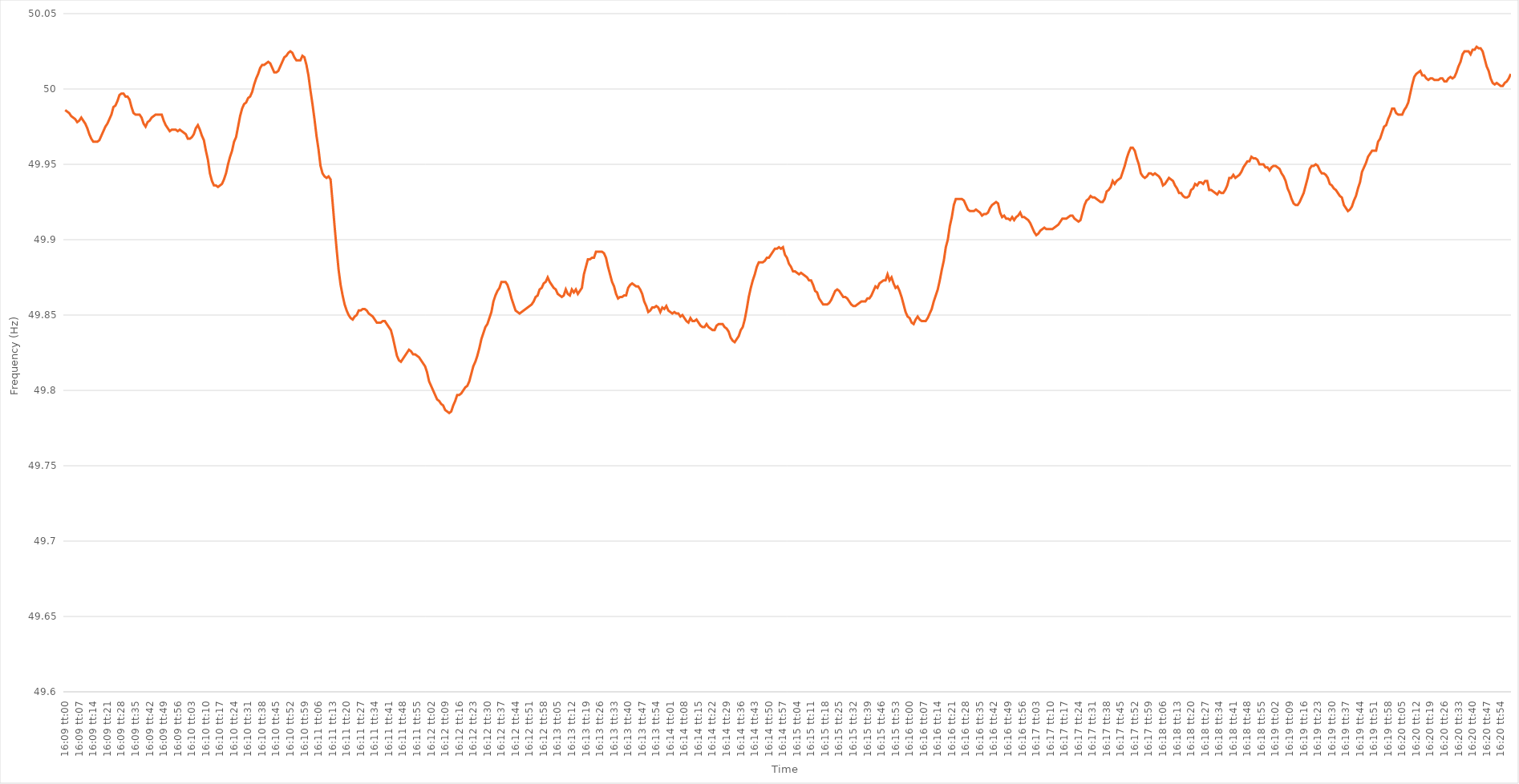
| Category | Series 0 |
|---|---|
| 0.6729166666666666 | 49.986 |
| 0.6729282407407408 | 49.985 |
| 0.6729398148148148 | 49.984 |
| 0.672951388888889 | 49.982 |
| 0.6729629629629629 | 49.981 |
| 0.672974537037037 | 49.98 |
| 0.6729861111111112 | 49.978 |
| 0.6729976851851852 | 49.979 |
| 0.6730092592592593 | 49.981 |
| 0.6730208333333333 | 49.979 |
| 0.6730324074074074 | 49.977 |
| 0.6730439814814816 | 49.974 |
| 0.6730555555555555 | 49.97 |
| 0.6730671296296297 | 49.967 |
| 0.6730787037037037 | 49.965 |
| 0.6730902777777777 | 49.965 |
| 0.6731018518518518 | 49.965 |
| 0.6731134259259259 | 49.966 |
| 0.6731250000000001 | 49.969 |
| 0.673136574074074 | 49.972 |
| 0.6731481481481482 | 49.975 |
| 0.6731597222222222 | 49.977 |
| 0.6731712962962964 | 49.98 |
| 0.6731828703703703 | 49.983 |
| 0.6731944444444444 | 49.988 |
| 0.6732060185185186 | 49.989 |
| 0.6732175925925926 | 49.992 |
| 0.6732291666666667 | 49.996 |
| 0.6732407407407407 | 49.997 |
| 0.6732523148148148 | 49.997 |
| 0.673263888888889 | 49.995 |
| 0.6732754629629629 | 49.995 |
| 0.6732870370370371 | 49.993 |
| 0.6732986111111111 | 49.988 |
| 0.6733101851851852 | 49.984 |
| 0.6733217592592592 | 49.983 |
| 0.6733333333333333 | 49.983 |
| 0.6733449074074075 | 49.983 |
| 0.6733564814814814 | 49.981 |
| 0.6733680555555556 | 49.977 |
| 0.6733796296296296 | 49.975 |
| 0.6733912037037038 | 49.978 |
| 0.6734027777777777 | 49.979 |
| 0.6734143518518518 | 49.981 |
| 0.673425925925926 | 49.982 |
| 0.6734375 | 49.983 |
| 0.6734490740740741 | 49.983 |
| 0.6734606481481481 | 49.983 |
| 0.6734722222222222 | 49.983 |
| 0.6734837962962964 | 49.979 |
| 0.6734953703703703 | 49.976 |
| 0.6735069444444445 | 49.974 |
| 0.6735185185185185 | 49.972 |
| 0.6735300925925927 | 49.973 |
| 0.6735416666666666 | 49.973 |
| 0.6735532407407407 | 49.973 |
| 0.6735648148148149 | 49.972 |
| 0.6735763888888888 | 49.973 |
| 0.673587962962963 | 49.972 |
| 0.673599537037037 | 49.971 |
| 0.6736111111111112 | 49.97 |
| 0.6736226851851851 | 49.967 |
| 0.6736342592592592 | 49.967 |
| 0.6736458333333334 | 49.968 |
| 0.6736574074074074 | 49.97 |
| 0.6736689814814815 | 49.974 |
| 0.6736805555555555 | 49.976 |
| 0.6736921296296297 | 49.973 |
| 0.6737037037037038 | 49.969 |
| 0.6737152777777777 | 49.966 |
| 0.6737268518518519 | 49.959 |
| 0.6737384259259259 | 49.953 |
| 0.6737500000000001 | 49.944 |
| 0.673761574074074 | 49.939 |
| 0.6737731481481481 | 49.936 |
| 0.6737847222222223 | 49.936 |
| 0.6737962962962962 | 49.935 |
| 0.6738078703703704 | 49.936 |
| 0.6738194444444444 | 49.937 |
| 0.6738310185185186 | 49.94 |
| 0.6738425925925925 | 49.944 |
| 0.6738541666666666 | 49.95 |
| 0.6738657407407408 | 49.955 |
| 0.6738773148148148 | 49.959 |
| 0.6738888888888889 | 49.965 |
| 0.6739004629629629 | 49.968 |
| 0.6739120370370371 | 49.975 |
| 0.6739236111111112 | 49.982 |
| 0.6739351851851851 | 49.987 |
| 0.6739467592592593 | 49.99 |
| 0.6739583333333333 | 49.991 |
| 0.6739699074074075 | 49.994 |
| 0.6739814814814814 | 49.995 |
| 0.6739930555555556 | 49.998 |
| 0.6740046296296297 | 50.003 |
| 0.6740162037037036 | 50.007 |
| 0.6740277777777778 | 50.01 |
| 0.6740393518518518 | 50.014 |
| 0.674050925925926 | 50.016 |
| 0.6740624999999999 | 50.016 |
| 0.674074074074074 | 50.017 |
| 0.6740856481481482 | 50.018 |
| 0.6740972222222222 | 50.017 |
| 0.6741087962962963 | 50.014 |
| 0.6741203703703703 | 50.011 |
| 0.6741319444444445 | 50.011 |
| 0.6741435185185186 | 50.012 |
| 0.6741550925925925 | 50.015 |
| 0.6741666666666667 | 50.018 |
| 0.6741782407407407 | 50.021 |
| 0.6741898148148149 | 50.022 |
| 0.6742013888888888 | 50.024 |
| 0.674212962962963 | 50.025 |
| 0.6742245370370371 | 50.024 |
| 0.6742361111111111 | 50.021 |
| 0.6742476851851852 | 50.019 |
| 0.6742592592592592 | 50.019 |
| 0.6742708333333334 | 50.019 |
| 0.6742824074074073 | 50.022 |
| 0.6742939814814815 | 50.021 |
| 0.6743055555555556 | 50.016 |
| 0.6743171296296296 | 50.009 |
| 0.6743287037037037 | 49.999 |
| 0.6743402777777777 | 49.99 |
| 0.6743518518518519 | 49.98 |
| 0.674363425925926 | 49.969 |
| 0.674375 | 49.96 |
| 0.6743865740740741 | 49.949 |
| 0.6743981481481481 | 49.944 |
| 0.6744097222222223 | 49.942 |
| 0.6744212962962962 | 49.941 |
| 0.6744328703703704 | 49.942 |
| 0.6744444444444445 | 49.94 |
| 0.6744560185185186 | 49.925 |
| 0.6744675925925926 | 49.909 |
| 0.6744791666666666 | 49.894 |
| 0.6744907407407408 | 49.88 |
| 0.6745023148148147 | 49.87 |
| 0.6745138888888889 | 49.863 |
| 0.674525462962963 | 49.857 |
| 0.674537037037037 | 49.853 |
| 0.6745486111111111 | 49.85 |
| 0.6745601851851851 | 49.848 |
| 0.6745717592592593 | 49.847 |
| 0.6745833333333334 | 49.849 |
| 0.6745949074074074 | 49.85 |
| 0.6746064814814815 | 49.853 |
| 0.6746180555555555 | 49.853 |
| 0.6746296296296297 | 49.854 |
| 0.6746412037037036 | 49.854 |
| 0.6746527777777778 | 49.853 |
| 0.6746643518518519 | 49.851 |
| 0.674675925925926 | 49.85 |
| 0.6746875 | 49.849 |
| 0.674699074074074 | 49.847 |
| 0.6747106481481482 | 49.845 |
| 0.6747222222222221 | 49.845 |
| 0.6747337962962963 | 49.845 |
| 0.6747453703703704 | 49.846 |
| 0.6747569444444445 | 49.846 |
| 0.6747685185185185 | 49.844 |
| 0.6747800925925925 | 49.842 |
| 0.6747916666666667 | 49.84 |
| 0.6748032407407408 | 49.835 |
| 0.6748148148148148 | 49.829 |
| 0.6748263888888889 | 49.823 |
| 0.674837962962963 | 49.82 |
| 0.6748495370370371 | 49.819 |
| 0.674861111111111 | 49.821 |
| 0.6748726851851852 | 49.823 |
| 0.6748842592592593 | 49.825 |
| 0.6748958333333334 | 49.827 |
| 0.6749074074074074 | 49.826 |
| 0.6749189814814814 | 49.824 |
| 0.6749305555555556 | 49.824 |
| 0.6749421296296297 | 49.823 |
| 0.6749537037037037 | 49.822 |
| 0.6749652777777778 | 49.82 |
| 0.6749768518518519 | 49.818 |
| 0.6749884259259259 | 49.816 |
| 0.6749999999999999 | 49.812 |
| 0.6750115740740741 | 49.806 |
| 0.6750231481481482 | 49.803 |
| 0.6750347222222222 | 49.8 |
| 0.6750462962962963 | 49.797 |
| 0.6750578703703703 | 49.794 |
| 0.6750694444444445 | 49.793 |
| 0.6750810185185184 | 49.791 |
| 0.6750925925925926 | 49.79 |
| 0.6751041666666667 | 49.787 |
| 0.6751157407407408 | 49.786 |
| 0.6751273148148148 | 49.785 |
| 0.6751388888888888 | 49.786 |
| 0.675150462962963 | 49.79 |
| 0.6751620370370371 | 49.793 |
| 0.6751736111111111 | 49.797 |
| 0.6751851851851852 | 49.797 |
| 0.6751967592592593 | 49.798 |
| 0.6752083333333333 | 49.8 |
| 0.6752199074074073 | 49.802 |
| 0.6752314814814815 | 49.803 |
| 0.6752430555555556 | 49.806 |
| 0.6752546296296296 | 49.811 |
| 0.6752662037037037 | 49.816 |
| 0.6752777777777778 | 49.819 |
| 0.6752893518518519 | 49.823 |
| 0.6753009259259258 | 49.828 |
| 0.6753125 | 49.834 |
| 0.6753240740740741 | 49.838 |
| 0.6753356481481482 | 49.842 |
| 0.6753472222222222 | 49.844 |
| 0.6753587962962962 | 49.848 |
| 0.6753703703703704 | 49.852 |
| 0.6753819444444445 | 49.859 |
| 0.6753935185185185 | 49.863 |
| 0.6754050925925926 | 49.866 |
| 0.6754166666666667 | 49.868 |
| 0.6754282407407407 | 49.872 |
| 0.6754398148148147 | 49.872 |
| 0.6754513888888889 | 49.872 |
| 0.675462962962963 | 49.87 |
| 0.675474537037037 | 49.866 |
| 0.6754861111111111 | 49.861 |
| 0.6754976851851852 | 49.857 |
| 0.6755092592592593 | 49.853 |
| 0.6755208333333332 | 49.852 |
| 0.6755324074074074 | 49.851 |
| 0.6755439814814815 | 49.852 |
| 0.6755555555555556 | 49.853 |
| 0.6755671296296296 | 49.854 |
| 0.6755787037037037 | 49.855 |
| 0.6755902777777778 | 49.856 |
| 0.675601851851852 | 49.857 |
| 0.6756134259259259 | 49.859 |
| 0.675625 | 49.862 |
| 0.6756365740740741 | 49.863 |
| 0.6756481481481482 | 49.867 |
| 0.6756597222222221 | 49.868 |
| 0.6756712962962963 | 49.871 |
| 0.6756828703703704 | 49.872 |
| 0.6756944444444444 | 49.875 |
| 0.6757060185185185 | 49.872 |
| 0.6757175925925926 | 49.87 |
| 0.6757291666666667 | 49.868 |
| 0.6757407407407406 | 49.867 |
| 0.6757523148148148 | 49.864 |
| 0.6757638888888889 | 49.863 |
| 0.675775462962963 | 49.862 |
| 0.675787037037037 | 49.863 |
| 0.6757986111111111 | 49.867 |
| 0.6758101851851852 | 49.864 |
| 0.6758217592592594 | 49.863 |
| 0.6758333333333333 | 49.867 |
| 0.6758449074074074 | 49.865 |
| 0.6758564814814815 | 49.867 |
| 0.6758680555555556 | 49.864 |
| 0.6758796296296296 | 49.866 |
| 0.6758912037037037 | 49.868 |
| 0.6759027777777779 | 49.877 |
| 0.6759143518518518 | 49.882 |
| 0.6759259259259259 | 49.887 |
| 0.6759375 | 49.887 |
| 0.6759490740740741 | 49.888 |
| 0.675960648148148 | 49.888 |
| 0.6759722222222222 | 49.892 |
| 0.6759837962962963 | 49.892 |
| 0.6759953703703704 | 49.892 |
| 0.6760069444444444 | 49.892 |
| 0.6760185185185185 | 49.891 |
| 0.6760300925925926 | 49.888 |
| 0.6760416666666668 | 49.882 |
| 0.6760532407407407 | 49.877 |
| 0.6760648148148148 | 49.872 |
| 0.6760763888888889 | 49.869 |
| 0.676087962962963 | 49.864 |
| 0.676099537037037 | 49.861 |
| 0.6761111111111111 | 49.862 |
| 0.6761226851851853 | 49.862 |
| 0.6761342592592593 | 49.863 |
| 0.6761458333333333 | 49.863 |
| 0.6761574074074074 | 49.868 |
| 0.6761689814814815 | 49.87 |
| 0.6761805555555555 | 49.871 |
| 0.6761921296296296 | 49.87 |
| 0.6762037037037038 | 49.869 |
| 0.6762152777777778 | 49.869 |
| 0.6762268518518518 | 49.867 |
| 0.6762384259259259 | 49.864 |
| 0.67625 | 49.859 |
| 0.6762615740740742 | 49.856 |
| 0.6762731481481481 | 49.852 |
| 0.6762847222222222 | 49.853 |
| 0.6762962962962963 | 49.855 |
| 0.6763078703703704 | 49.855 |
| 0.6763194444444444 | 49.856 |
| 0.6763310185185185 | 49.855 |
| 0.6763425925925927 | 49.852 |
| 0.6763541666666667 | 49.855 |
| 0.6763657407407407 | 49.854 |
| 0.6763773148148148 | 49.856 |
| 0.6763888888888889 | 49.853 |
| 0.6764004629629629 | 49.852 |
| 0.676412037037037 | 49.851 |
| 0.6764236111111112 | 49.852 |
| 0.6764351851851852 | 49.851 |
| 0.6764467592592592 | 49.851 |
| 0.6764583333333333 | 49.849 |
| 0.6764699074074074 | 49.85 |
| 0.6764814814814816 | 49.848 |
| 0.6764930555555555 | 49.846 |
| 0.6765046296296297 | 49.845 |
| 0.6765162037037037 | 49.848 |
| 0.6765277777777778 | 49.846 |
| 0.6765393518518518 | 49.846 |
| 0.6765509259259259 | 49.847 |
| 0.6765625000000001 | 49.845 |
| 0.6765740740740741 | 49.843 |
| 0.6765856481481481 | 49.842 |
| 0.6765972222222222 | 49.842 |
| 0.6766087962962963 | 49.844 |
| 0.6766203703703703 | 49.842 |
| 0.6766319444444444 | 49.841 |
| 0.6766435185185186 | 49.84 |
| 0.6766550925925926 | 49.84 |
| 0.6766666666666666 | 49.843 |
| 0.6766782407407407 | 49.844 |
| 0.6766898148148148 | 49.844 |
| 0.676701388888889 | 49.844 |
| 0.6767129629629629 | 49.842 |
| 0.676724537037037 | 49.841 |
| 0.6767361111111111 | 49.839 |
| 0.6767476851851852 | 49.835 |
| 0.6767592592592592 | 49.833 |
| 0.6767708333333333 | 49.832 |
| 0.6767824074074075 | 49.834 |
| 0.6767939814814815 | 49.836 |
| 0.6768055555555555 | 49.84 |
| 0.6768171296296296 | 49.842 |
| 0.6768287037037037 | 49.847 |
| 0.6768402777777779 | 49.854 |
| 0.6768518518518518 | 49.862 |
| 0.676863425925926 | 49.868 |
| 0.676875 | 49.873 |
| 0.676886574074074 | 49.877 |
| 0.6768981481481481 | 49.882 |
| 0.6769097222222222 | 49.885 |
| 0.6769212962962964 | 49.885 |
| 0.6769328703703703 | 49.885 |
| 0.6769444444444445 | 49.886 |
| 0.6769560185185185 | 49.888 |
| 0.6769675925925926 | 49.888 |
| 0.6769791666666666 | 49.89 |
| 0.6769907407407407 | 49.892 |
| 0.6770023148148149 | 49.894 |
| 0.6770138888888889 | 49.894 |
| 0.677025462962963 | 49.895 |
| 0.677037037037037 | 49.894 |
| 0.6770486111111111 | 49.895 |
| 0.6770601851851853 | 49.89 |
| 0.6770717592592592 | 49.888 |
| 0.6770833333333334 | 49.884 |
| 0.6770949074074074 | 49.882 |
| 0.6771064814814814 | 49.879 |
| 0.6771180555555555 | 49.879 |
| 0.6771296296296296 | 49.878 |
| 0.6771412037037038 | 49.877 |
| 0.6771527777777777 | 49.878 |
| 0.6771643518518519 | 49.877 |
| 0.6771759259259259 | 49.876 |
| 0.6771875 | 49.875 |
| 0.677199074074074 | 49.873 |
| 0.6772106481481481 | 49.873 |
| 0.6772222222222223 | 49.87 |
| 0.6772337962962963 | 49.866 |
| 0.6772453703703704 | 49.865 |
| 0.6772569444444444 | 49.861 |
| 0.6772685185185185 | 49.859 |
| 0.6772800925925927 | 49.857 |
| 0.6772916666666666 | 49.857 |
| 0.6773032407407408 | 49.857 |
| 0.6773148148148148 | 49.858 |
| 0.6773263888888889 | 49.86 |
| 0.6773379629629629 | 49.863 |
| 0.677349537037037 | 49.866 |
| 0.6773611111111112 | 49.867 |
| 0.6773726851851851 | 49.866 |
| 0.6773842592592593 | 49.864 |
| 0.6773958333333333 | 49.862 |
| 0.6774074074074075 | 49.862 |
| 0.6774189814814814 | 49.861 |
| 0.6774305555555555 | 49.859 |
| 0.6774421296296297 | 49.857 |
| 0.6774537037037037 | 49.856 |
| 0.6774652777777778 | 49.856 |
| 0.6774768518518518 | 49.857 |
| 0.677488425925926 | 49.858 |
| 0.6775000000000001 | 49.859 |
| 0.677511574074074 | 49.859 |
| 0.6775231481481482 | 49.859 |
| 0.6775347222222222 | 49.861 |
| 0.6775462962962964 | 49.861 |
| 0.6775578703703703 | 49.863 |
| 0.6775694444444444 | 49.866 |
| 0.6775810185185186 | 49.869 |
| 0.6775925925925925 | 49.868 |
| 0.6776041666666667 | 49.871 |
| 0.6776157407407407 | 49.872 |
| 0.6776273148148149 | 49.873 |
| 0.6776388888888888 | 49.873 |
| 0.6776504629629629 | 49.877 |
| 0.6776620370370371 | 49.873 |
| 0.6776736111111111 | 49.875 |
| 0.6776851851851852 | 49.871 |
| 0.6776967592592592 | 49.868 |
| 0.6777083333333334 | 49.869 |
| 0.6777199074074075 | 49.866 |
| 0.6777314814814814 | 49.862 |
| 0.6777430555555556 | 49.857 |
| 0.6777546296296296 | 49.852 |
| 0.6777662037037038 | 49.849 |
| 0.6777777777777777 | 49.848 |
| 0.6777893518518519 | 49.845 |
| 0.677800925925926 | 49.844 |
| 0.6778124999999999 | 49.847 |
| 0.6778240740740741 | 49.849 |
| 0.6778356481481481 | 49.847 |
| 0.6778472222222223 | 49.846 |
| 0.6778587962962962 | 49.846 |
| 0.6778703703703703 | 49.846 |
| 0.6778819444444445 | 49.848 |
| 0.6778935185185185 | 49.851 |
| 0.6779050925925926 | 49.854 |
| 0.6779166666666666 | 49.859 |
| 0.6779282407407408 | 49.863 |
| 0.6779398148148149 | 49.867 |
| 0.6779513888888888 | 49.873 |
| 0.677962962962963 | 49.88 |
| 0.677974537037037 | 49.886 |
| 0.6779861111111112 | 49.895 |
| 0.6779976851851851 | 49.9 |
| 0.6780092592592593 | 49.909 |
| 0.6780208333333334 | 49.915 |
| 0.6780324074074073 | 49.923 |
| 0.6780439814814815 | 49.927 |
| 0.6780555555555555 | 49.927 |
| 0.6780671296296297 | 49.927 |
| 0.6780787037037036 | 49.927 |
| 0.6780902777777778 | 49.926 |
| 0.6781018518518519 | 49.923 |
| 0.6781134259259259 | 49.92 |
| 0.678125 | 49.919 |
| 0.678136574074074 | 49.919 |
| 0.6781481481481482 | 49.919 |
| 0.6781597222222223 | 49.92 |
| 0.6781712962962962 | 49.919 |
| 0.6781828703703704 | 49.918 |
| 0.6781944444444444 | 49.916 |
| 0.6782060185185186 | 49.917 |
| 0.6782175925925925 | 49.917 |
| 0.6782291666666667 | 49.918 |
| 0.6782407407407408 | 49.921 |
| 0.6782523148148148 | 49.923 |
| 0.6782638888888889 | 49.924 |
| 0.6782754629629629 | 49.925 |
| 0.6782870370370371 | 49.924 |
| 0.678298611111111 | 49.918 |
| 0.6783101851851852 | 49.915 |
| 0.6783217592592593 | 49.916 |
| 0.6783333333333333 | 49.914 |
| 0.6783449074074074 | 49.914 |
| 0.6783564814814814 | 49.913 |
| 0.6783680555555556 | 49.915 |
| 0.6783796296296297 | 49.913 |
| 0.6783912037037036 | 49.915 |
| 0.6784027777777778 | 49.916 |
| 0.6784143518518518 | 49.918 |
| 0.678425925925926 | 49.915 |
| 0.6784374999999999 | 49.915 |
| 0.6784490740740741 | 49.914 |
| 0.6784606481481482 | 49.913 |
| 0.6784722222222223 | 49.911 |
| 0.6784837962962963 | 49.908 |
| 0.6784953703703703 | 49.905 |
| 0.6785069444444445 | 49.903 |
| 0.6785185185185184 | 49.904 |
| 0.6785300925925926 | 49.906 |
| 0.6785416666666667 | 49.907 |
| 0.6785532407407407 | 49.908 |
| 0.6785648148148148 | 49.907 |
| 0.6785763888888888 | 49.907 |
| 0.678587962962963 | 49.907 |
| 0.6785995370370371 | 49.907 |
| 0.678611111111111 | 49.908 |
| 0.6786226851851852 | 49.909 |
| 0.6786342592592592 | 49.91 |
| 0.6786458333333334 | 49.912 |
| 0.6786574074074073 | 49.914 |
| 0.6786689814814815 | 49.914 |
| 0.6786805555555556 | 49.914 |
| 0.6786921296296297 | 49.915 |
| 0.6787037037037037 | 49.916 |
| 0.6787152777777777 | 49.916 |
| 0.6787268518518519 | 49.914 |
| 0.678738425925926 | 49.913 |
| 0.67875 | 49.912 |
| 0.6787615740740741 | 49.913 |
| 0.6787731481481482 | 49.918 |
| 0.6787847222222222 | 49.923 |
| 0.6787962962962962 | 49.926 |
| 0.6788078703703704 | 49.927 |
| 0.6788194444444445 | 49.929 |
| 0.6788310185185185 | 49.928 |
| 0.6788425925925926 | 49.928 |
| 0.6788541666666666 | 49.927 |
| 0.6788657407407408 | 49.926 |
| 0.6788773148148147 | 49.925 |
| 0.6788888888888889 | 49.925 |
| 0.678900462962963 | 49.927 |
| 0.6789120370370371 | 49.932 |
| 0.6789236111111111 | 49.933 |
| 0.6789351851851851 | 49.935 |
| 0.6789467592592593 | 49.939 |
| 0.6789583333333334 | 49.937 |
| 0.6789699074074074 | 49.939 |
| 0.6789814814814815 | 49.94 |
| 0.6789930555555556 | 49.941 |
| 0.6790046296296296 | 49.945 |
| 0.6790162037037036 | 49.949 |
| 0.6790277777777778 | 49.954 |
| 0.6790393518518519 | 49.958 |
| 0.6790509259259259 | 49.961 |
| 0.6790625 | 49.961 |
| 0.679074074074074 | 49.959 |
| 0.6790856481481482 | 49.954 |
| 0.6790972222222221 | 49.95 |
| 0.6791087962962963 | 49.944 |
| 0.6791203703703704 | 49.942 |
| 0.6791319444444445 | 49.941 |
| 0.6791435185185185 | 49.942 |
| 0.6791550925925925 | 49.944 |
| 0.6791666666666667 | 49.944 |
| 0.6791782407407408 | 49.943 |
| 0.6791898148148148 | 49.944 |
| 0.6792013888888889 | 49.943 |
| 0.679212962962963 | 49.942 |
| 0.679224537037037 | 49.94 |
| 0.679236111111111 | 49.936 |
| 0.6792476851851852 | 49.937 |
| 0.6792592592592593 | 49.939 |
| 0.6792708333333333 | 49.941 |
| 0.6792824074074074 | 49.94 |
| 0.6792939814814815 | 49.939 |
| 0.6793055555555556 | 49.936 |
| 0.6793171296296295 | 49.934 |
| 0.6793287037037037 | 49.931 |
| 0.6793402777777778 | 49.931 |
| 0.6793518518518519 | 49.929 |
| 0.6793634259259259 | 49.928 |
| 0.679375 | 49.928 |
| 0.6793865740740741 | 49.929 |
| 0.6793981481481483 | 49.933 |
| 0.6794097222222222 | 49.934 |
| 0.6794212962962963 | 49.937 |
| 0.6794328703703704 | 49.936 |
| 0.6794444444444444 | 49.938 |
| 0.6794560185185184 | 49.938 |
| 0.6794675925925926 | 49.937 |
| 0.6794791666666667 | 49.939 |
| 0.6794907407407407 | 49.939 |
| 0.6795023148148148 | 49.933 |
| 0.6795138888888889 | 49.933 |
| 0.679525462962963 | 49.932 |
| 0.6795370370370369 | 49.931 |
| 0.6795486111111111 | 49.93 |
| 0.6795601851851852 | 49.932 |
| 0.6795717592592593 | 49.931 |
| 0.6795833333333333 | 49.931 |
| 0.6795949074074074 | 49.933 |
| 0.6796064814814815 | 49.936 |
| 0.6796180555555557 | 49.941 |
| 0.6796296296296296 | 49.941 |
| 0.6796412037037037 | 49.943 |
| 0.6796527777777778 | 49.941 |
| 0.6796643518518519 | 49.942 |
| 0.6796759259259259 | 49.943 |
| 0.6796875 | 49.945 |
| 0.6796990740740741 | 49.948 |
| 0.6797106481481481 | 49.95 |
| 0.6797222222222222 | 49.952 |
| 0.6797337962962963 | 49.952 |
| 0.6797453703703704 | 49.955 |
| 0.6797569444444443 | 49.954 |
| 0.6797685185185185 | 49.954 |
| 0.6797800925925926 | 49.953 |
| 0.6797916666666667 | 49.95 |
| 0.6798032407407407 | 49.95 |
| 0.6798148148148148 | 49.95 |
| 0.6798263888888889 | 49.948 |
| 0.6798379629629631 | 49.948 |
| 0.679849537037037 | 49.946 |
| 0.6798611111111111 | 49.948 |
| 0.6798726851851852 | 49.949 |
| 0.6798842592592593 | 49.949 |
| 0.6798958333333333 | 49.948 |
| 0.6799074074074074 | 49.947 |
| 0.6799189814814816 | 49.944 |
| 0.6799305555555556 | 49.942 |
| 0.6799421296296296 | 49.939 |
| 0.6799537037037037 | 49.934 |
| 0.6799652777777778 | 49.931 |
| 0.6799768518518517 | 49.927 |
| 0.6799884259259259 | 49.924 |
| 0.68 | 49.923 |
| 0.6800115740740741 | 49.923 |
| 0.6800231481481481 | 49.925 |
| 0.6800347222222222 | 49.928 |
| 0.6800462962962963 | 49.931 |
| 0.6800578703703705 | 49.936 |
| 0.6800694444444444 | 49.941 |
| 0.6800810185185185 | 49.947 |
| 0.6800925925925926 | 49.949 |
| 0.6801041666666667 | 49.949 |
| 0.6801157407407407 | 49.95 |
| 0.6801273148148148 | 49.949 |
| 0.680138888888889 | 49.946 |
| 0.680150462962963 | 49.944 |
| 0.680162037037037 | 49.944 |
| 0.6801736111111111 | 49.943 |
| 0.6801851851851852 | 49.941 |
| 0.6801967592592592 | 49.937 |
| 0.6802083333333333 | 49.936 |
| 0.6802199074074075 | 49.934 |
| 0.6802314814814815 | 49.933 |
| 0.6802430555555555 | 49.931 |
| 0.6802546296296296 | 49.929 |
| 0.6802662037037037 | 49.928 |
| 0.6802777777777779 | 49.923 |
| 0.6802893518518518 | 49.921 |
| 0.680300925925926 | 49.919 |
| 0.6803125 | 49.92 |
| 0.6803240740740741 | 49.922 |
| 0.6803356481481481 | 49.926 |
| 0.6803472222222222 | 49.929 |
| 0.6803587962962964 | 49.934 |
| 0.6803703703703704 | 49.938 |
| 0.6803819444444444 | 49.945 |
| 0.6803935185185185 | 49.948 |
| 0.6804050925925926 | 49.951 |
| 0.6804166666666666 | 49.955 |
| 0.6804282407407407 | 49.957 |
| 0.6804398148148149 | 49.959 |
| 0.6804513888888889 | 49.959 |
| 0.6804629629629629 | 49.959 |
| 0.680474537037037 | 49.965 |
| 0.6804861111111111 | 49.967 |
| 0.6804976851851853 | 49.971 |
| 0.6805092592592592 | 49.975 |
| 0.6805208333333334 | 49.976 |
| 0.6805324074074074 | 49.98 |
| 0.6805439814814815 | 49.983 |
| 0.6805555555555555 | 49.987 |
| 0.6805671296296296 | 49.987 |
| 0.6805787037037038 | 49.984 |
| 0.6805902777777778 | 49.983 |
| 0.6806018518518518 | 49.983 |
| 0.6806134259259259 | 49.983 |
| 0.680625 | 49.986 |
| 0.680636574074074 | 49.988 |
| 0.6806481481481481 | 49.991 |
| 0.6806597222222223 | 49.997 |
| 0.6806712962962963 | 50.003 |
| 0.6806828703703703 | 50.008 |
| 0.6806944444444444 | 50.01 |
| 0.6807060185185185 | 50.011 |
| 0.6807175925925927 | 50.012 |
| 0.6807291666666666 | 50.009 |
| 0.6807407407407408 | 50.009 |
| 0.6807523148148148 | 50.007 |
| 0.680763888888889 | 50.006 |
| 0.6807754629629629 | 50.007 |
| 0.680787037037037 | 50.007 |
| 0.6807986111111112 | 50.006 |
| 0.6808101851851852 | 50.006 |
| 0.6808217592592593 | 50.006 |
| 0.6808333333333333 | 50.007 |
| 0.6808449074074074 | 50.007 |
| 0.6808564814814816 | 50.005 |
| 0.6808680555555555 | 50.005 |
| 0.6808796296296297 | 50.007 |
| 0.6808912037037037 | 50.008 |
| 0.6809027777777777 | 50.007 |
| 0.6809143518518518 | 50.008 |
| 0.6809259259259259 | 50.011 |
| 0.6809375000000001 | 50.015 |
| 0.680949074074074 | 50.018 |
| 0.6809606481481482 | 50.023 |
| 0.6809722222222222 | 50.025 |
| 0.6809837962962964 | 50.025 |
| 0.6809953703703703 | 50.025 |
| 0.6810069444444444 | 50.023 |
| 0.6810185185185186 | 50.026 |
| 0.6810300925925926 | 50.026 |
| 0.6810416666666667 | 50.028 |
| 0.6810532407407407 | 50.027 |
| 0.6810648148148148 | 50.027 |
| 0.681076388888889 | 50.025 |
| 0.6810879629629629 | 50.02 |
| 0.6810995370370371 | 50.015 |
| 0.6811111111111111 | 50.012 |
| 0.6811226851851852 | 50.007 |
| 0.6811342592592592 | 50.004 |
| 0.6811458333333333 | 50.003 |
| 0.6811574074074075 | 50.004 |
| 0.6811689814814814 | 50.003 |
| 0.6811805555555556 | 50.002 |
| 0.6811921296296296 | 50.002 |
| 0.6812037037037038 | 50.004 |
| 0.6812152777777777 | 50.005 |
| 0.6812268518518518 | 50.007 |
| 0.681238425925926 | 50.01 |